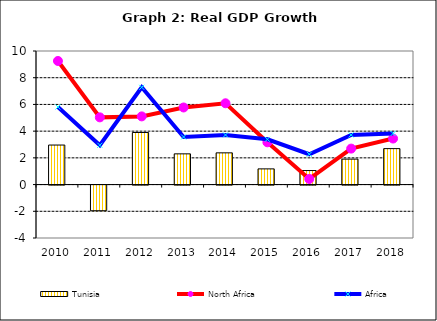
| Category | Tunisia |
|---|---|
| 2010.0 | 2.96 |
| 2011.0 | -1.92 |
| 2012.0 | 3.9 |
| 2013.0 | 2.3 |
| 2014.0 | 2.375 |
| 2015.0 | 1.175 |
| 2016.0 | 1.05 |
| 2017.0 | 1.905 |
| 2018.0 | 2.692 |